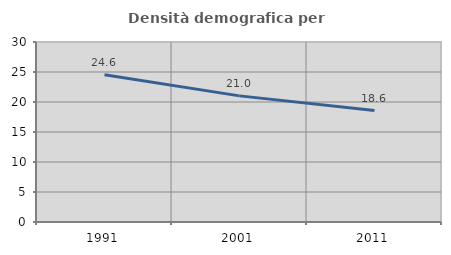
| Category | Densità demografica |
|---|---|
| 1991.0 | 24.555 |
| 2001.0 | 21.021 |
| 2011.0 | 18.579 |